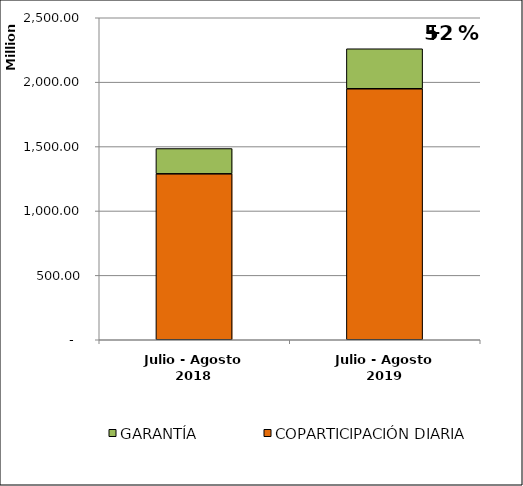
| Category | COPARTICIPACIÓN DIARIA | GARANTÍA |
|---|---|---|
| Julio - Agosto 2018 | 1288418992.88 | 196339859.37 |
| Julio - Agosto 2019 | 1948648058.705 | 310750620.46 |